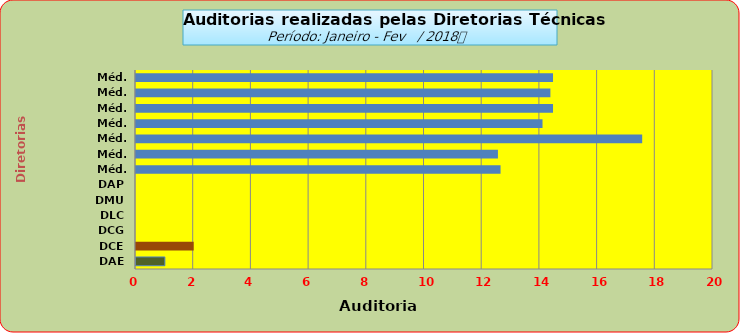
| Category | Series 0 |
|---|---|
| DAE | 1 |
| DCE | 2 |
| DCG | 0 |
| DLC | 0 |
| DMU | 0 |
| DAP | 0 |
| Méd. 2011 | 12.636 |
| Méd. 2012 | 12.545 |
| Méd. 2013 | 17.545 |
| Méd. 2014 | 14.091 |
| Méd. 2015 | 14.455 |
| Méd. 2016 | 14.364 |
| Méd. 2017 | 14.455 |